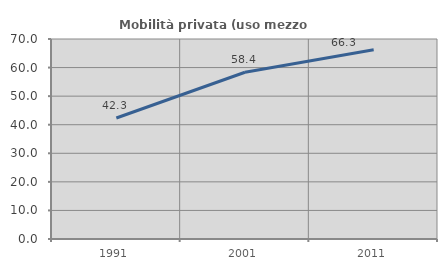
| Category | Mobilità privata (uso mezzo privato) |
|---|---|
| 1991.0 | 42.344 |
| 2001.0 | 58.357 |
| 2011.0 | 66.253 |